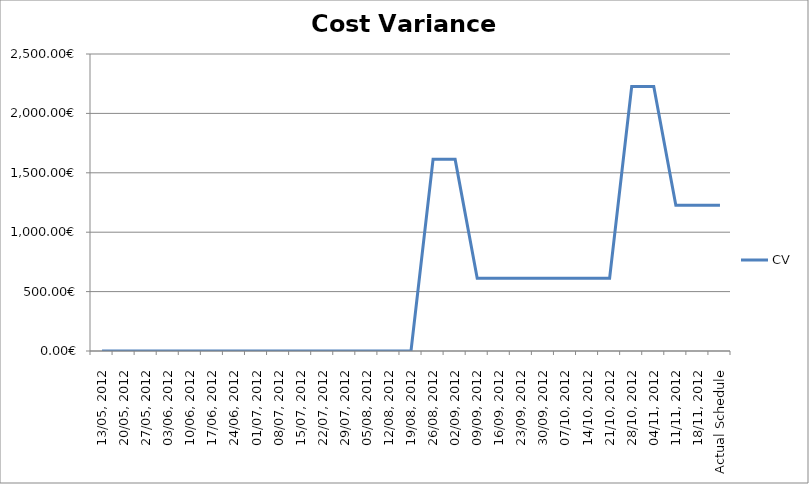
| Category | CV |
|---|---|
| 13/05, 2012 | 0 |
| 20/05, 2012 | 0 |
| 27/05, 2012 | 0 |
| 03/06, 2012 | 0 |
| 10/06, 2012 | 0 |
| 17/06, 2012 | 0 |
| 24/06, 2012 | 0 |
| 01/07, 2012 | 0 |
| 08/07, 2012 | 0 |
| 15/07, 2012 | 0 |
| 22/07, 2012 | 0 |
| 29/07, 2012 | 0 |
| 05/08, 2012 | 0 |
| 12/08, 2012 | 0 |
| 19/08, 2012 | 0 |
| 26/08, 2012 | 1613.1 |
| 02/09, 2012 | 1613.1 |
| 09/09, 2012 | 613.1 |
| 16/09, 2012 | 613.1 |
| 23/09, 2012 | 613.1 |
| 30/09, 2012 | 613.1 |
| 07/10, 2012 | 613.1 |
| 14/10, 2012 | 613.1 |
| 21/10, 2012 | 613.1 |
| 28/10, 2012 | 2226.2 |
| 04/11, 2012 | 2226.2 |
| 11/11, 2012 | 1226.2 |
| 18/11, 2012 | 1226.2 |
| Actual Schedule | 1226.2 |